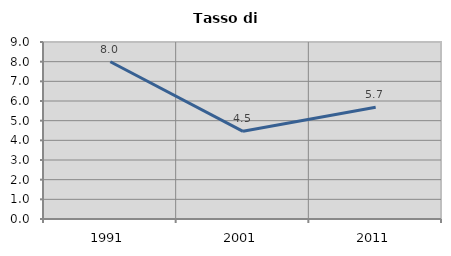
| Category | Tasso di disoccupazione   |
|---|---|
| 1991.0 | 7.996 |
| 2001.0 | 4.459 |
| 2011.0 | 5.678 |